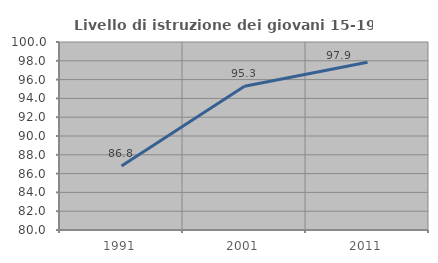
| Category | Livello di istruzione dei giovani 15-19 anni |
|---|---|
| 1991.0 | 86.806 |
| 2001.0 | 95.287 |
| 2011.0 | 97.85 |